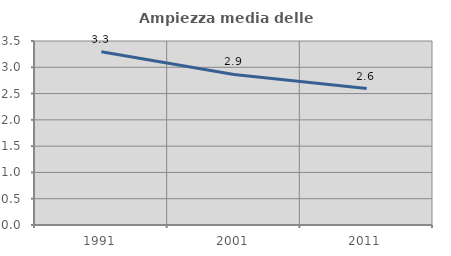
| Category | Ampiezza media delle famiglie |
|---|---|
| 1991.0 | 3.296 |
| 2001.0 | 2.865 |
| 2011.0 | 2.596 |